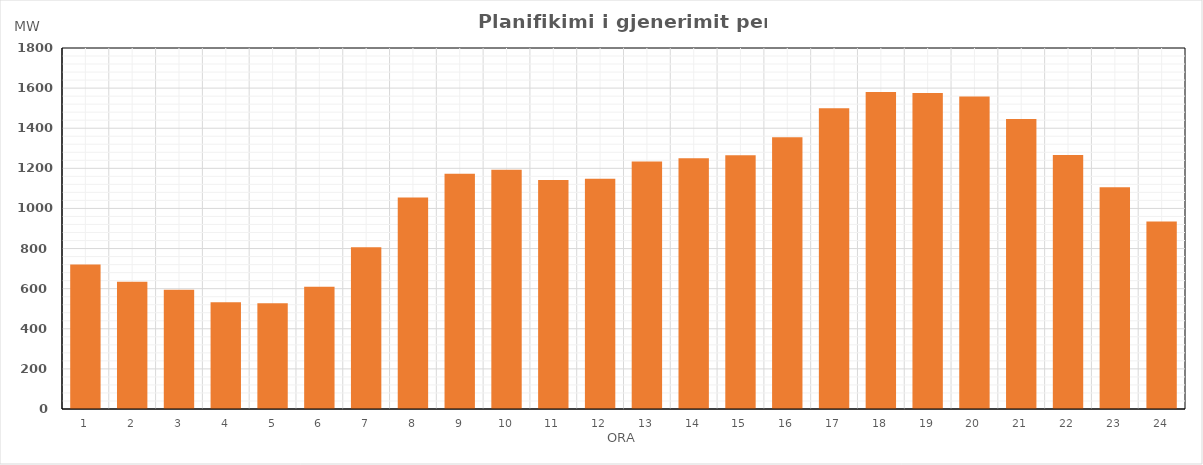
| Category | Max (MW) |
|---|---|
| 0 | 720.57 |
| 1 | 634.35 |
| 2 | 594.24 |
| 3 | 532.74 |
| 4 | 527.23 |
| 5 | 609.85 |
| 6 | 806.14 |
| 7 | 1054.63 |
| 8 | 1172.42 |
| 9 | 1192.45 |
| 10 | 1141.34 |
| 11 | 1147.83 |
| 12 | 1234.62 |
| 13 | 1250.32 |
| 14 | 1264.69 |
| 15 | 1354.57 |
| 16 | 1499.58 |
| 17 | 1580.33 |
| 18 | 1576.15 |
| 19 | 1558.66 |
| 20 | 1446.45 |
| 21 | 1266.37 |
| 22 | 1105.38 |
| 23 | 934.6 |